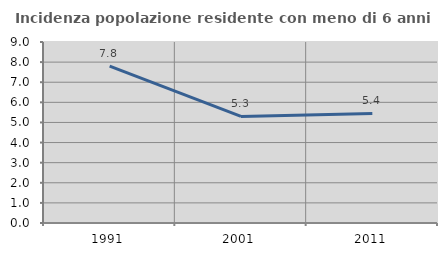
| Category | Incidenza popolazione residente con meno di 6 anni |
|---|---|
| 1991.0 | 7.801 |
| 2001.0 | 5.297 |
| 2011.0 | 5.446 |